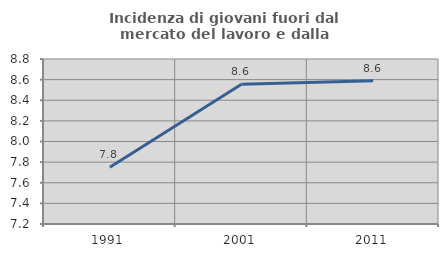
| Category | Incidenza di giovani fuori dal mercato del lavoro e dalla formazione  |
|---|---|
| 1991.0 | 7.751 |
| 2001.0 | 8.555 |
| 2011.0 | 8.588 |